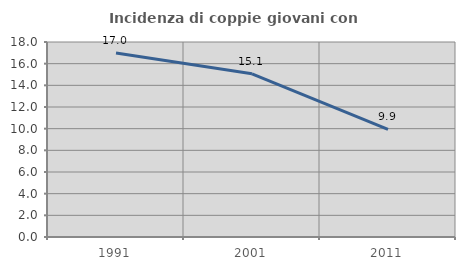
| Category | Incidenza di coppie giovani con figli |
|---|---|
| 1991.0 | 16.978 |
| 2001.0 | 15.063 |
| 2011.0 | 9.936 |